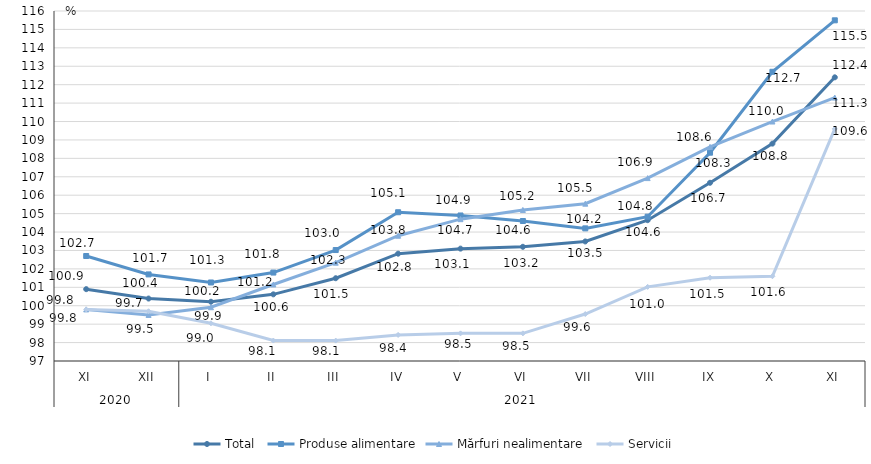
| Category | Total  | Produse alimentare | Mărfuri nealimentare  | Servicii |
|---|---|---|---|---|
| 0 | 100.9 | 102.7 | 99.8 | 99.8 |
| 1 | 100.39 | 101.7 | 99.5 | 99.7 |
| 2 | 100.216 | 101.263 | 99.917 | 99.046 |
| 3 | 100.619 | 101.8 | 101.154 | 98.109 |
| 4 | 101.493 | 103.024 | 102.337 | 98.107 |
| 5 | 102.826 | 105.075 | 103.801 | 98.417 |
| 6 | 103.1 | 104.9 | 104.7 | 98.5 |
| 7 | 103.2 | 104.6 | 105.2 | 98.5 |
| 8 | 103.49 | 104.2 | 105.54 | 99.55 |
| 9 | 104.645 | 104.834 | 106.928 | 101.023 |
| 10 | 106.675 | 108.308 | 108.624 | 101.521 |
| 11 | 108.8 | 112.7 | 110 | 101.6 |
| 12 | 112.4 | 115.494 | 111.3 | 109.6 |